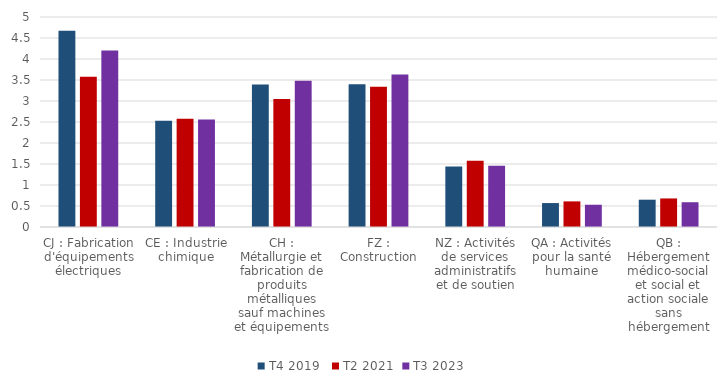
| Category | T4 2019  | T2 2021 | T3 2023 |
|---|---|---|---|
| CJ : Fabrication d'équipements électriques | 4.67 | 3.58 | 4.2 |
| CE : Industrie chimique | 2.53 | 2.58 | 2.56 |
| CH : Métallurgie et fabrication de produits métalliques sauf machines et équipements | 3.39 | 3.05 | 3.48 |
| FZ : Construction | 3.4 | 3.34 | 3.63 |
| NZ : Activités de services administratifs et de soutien | 1.44 | 1.58 | 1.46 |
| QA : Activités pour la santé humaine | 0.57 | 0.61 | 0.53 |
| QB : Hébergement médico-social et social et action sociale sans hébergement | 0.65 | 0.68 | 0.59 |